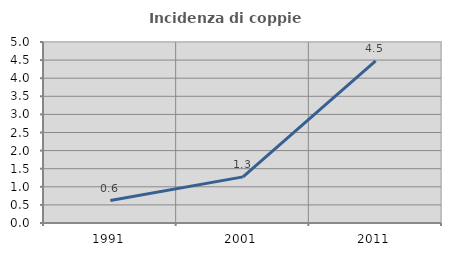
| Category | Incidenza di coppie miste |
|---|---|
| 1991.0 | 0.621 |
| 2001.0 | 1.274 |
| 2011.0 | 4.478 |